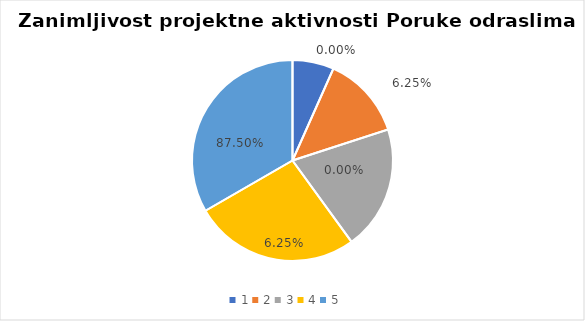
| Category | Series 0 | Series 1 |
|---|---|---|
| 0 | 1 | 0 |
| 1 | 2 | 0.062 |
| 2 | 3 | 0 |
| 3 | 4 | 0.062 |
| 4 | 5 | 0.875 |